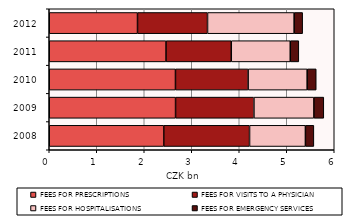
| Category | FEES FOR PRESCRIPTIONS | FEES FOR VISITS TO A PHYSICIAN | FEES FOR HOSPITALISATIONS | FEES FOR EMERGENCY SERVICES |
|---|---|---|---|---|
| 2008.0 | 2411 | 1806 | 1176 | 178 |
| 2009.0 | 2659 | 1650 | 1263 | 208 |
| 2010.0 | 2657 | 1530 | 1243 | 191 |
| 2011.0 | 2458 | 1374 | 1242 | 180 |
| 2012.0 | 1858 | 1474 | 1824 | 179 |